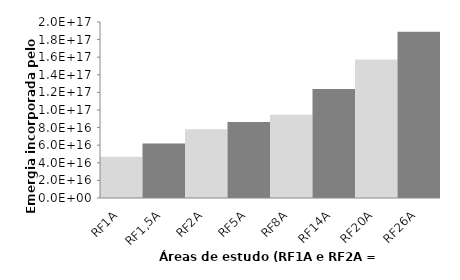
| Category | Series 0 |
|---|---|
| RF1A | 46915375674476976 |
| RF1,5A | 61972413334963496 |
| RF2A | 78113975153240512 |
| RF5A | 86317735732488272 |
| RF8A | 94612884185984512 |
| RF14A | 123971927506796368 |
| RF20A | 157449769254270912 |
| RF26A | 188884681453661504 |